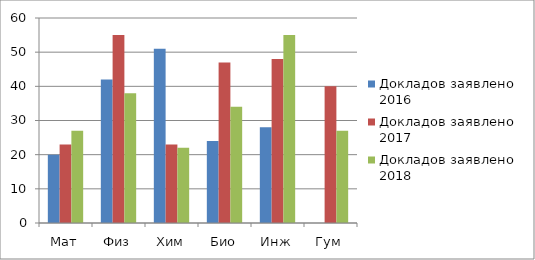
| Category | Докладов заявлено 2016 | Докладов заявлено 2017 | Докладов заявлено 2018 |
|---|---|---|---|
| Мат | 20 | 23 | 27 |
| Физ | 42 | 55 | 38 |
| Хим | 51 | 23 | 22 |
| Био | 24 | 47 | 34 |
| Инж | 28 | 48 | 55 |
| Гум | 0 | 40 | 27 |